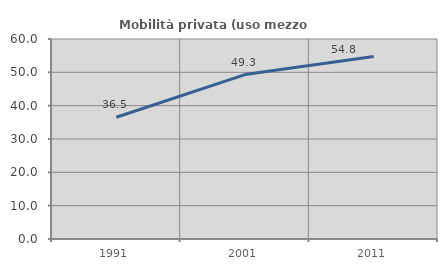
| Category | Mobilità privata (uso mezzo privato) |
|---|---|
| 1991.0 | 36.522 |
| 2001.0 | 49.319 |
| 2011.0 | 54.768 |